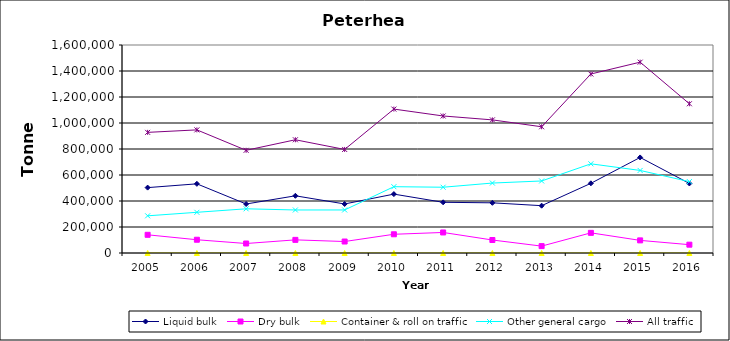
| Category | Liquid bulk | Dry bulk | Container & roll on traffic | Other general cargo | All traffic |
|---|---|---|---|---|---|
| 2005.0 | 503000 | 140000 | 0 | 286000 | 928000 |
| 2006.0 | 532000 | 102000 | 0 | 313000 | 947000 |
| 2007.0 | 377000 | 73000 | 0 | 340000 | 790000 |
| 2008.0 | 440000 | 101000 | 0 | 331000 | 871000 |
| 2009.0 | 377249 | 88298 | 0 | 331033 | 796580 |
| 2010.0 | 453000 | 144000 | 0 | 510000 | 1107000 |
| 2011.0 | 390000 | 158000 | 0 | 506000 | 1054000 |
| 2012.0 | 386000 | 100000 | 0 | 538000 | 1024000 |
| 2013.0 | 364000 | 53000 | 0 | 554000 | 971000 |
| 2014.0 | 536000 | 155000 | 0 | 686000 | 1377000 |
| 2015.0 | 735000 | 97000 | 0 | 635000 | 1468000 |
| 2016.0 | 535000 | 64000 | 0 | 549000 | 1148000 |